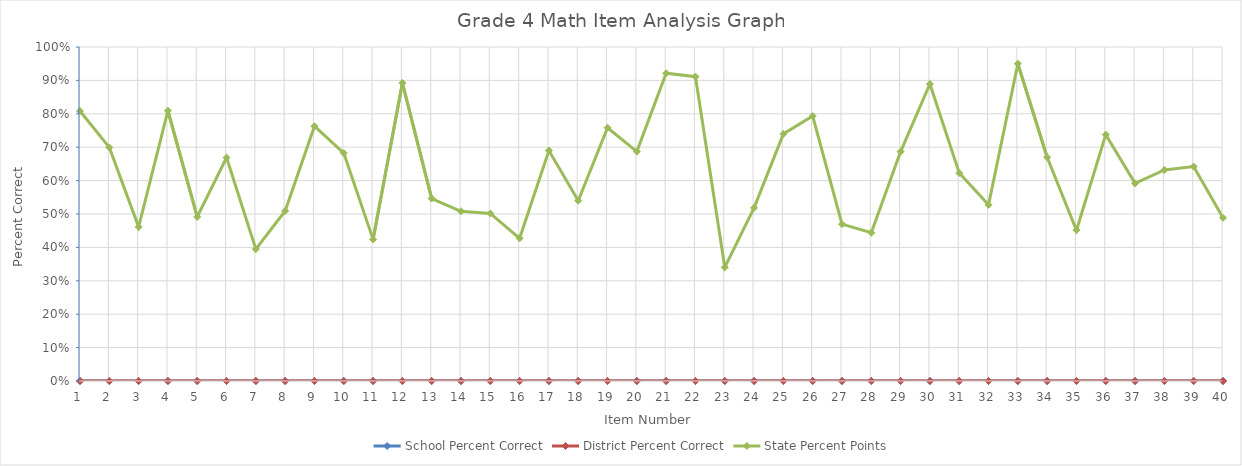
| Category | School Percent Correct | District Percent Correct | State Percent Points |
|---|---|---|---|
| 1.0 | 0 | 0 | 0.808 |
| 2.0 | 0 | 0 | 0.699 |
| 3.0 | 0 | 0 | 0.461 |
| 4.0 | 0 | 0 | 0.809 |
| 5.0 | 0 | 0 | 0.491 |
| 6.0 | 0 | 0 | 0.669 |
| 7.0 | 0 | 0 | 0.395 |
| 8.0 | 0 | 0 | 0.509 |
| 9.0 | 0 | 0 | 0.763 |
| 10.0 | 0 | 0 | 0.682 |
| 11.0 | 0 | 0 | 0.424 |
| 12.0 | 0 | 0 | 0.892 |
| 13.0 | 0 | 0 | 0.546 |
| 14.0 | 0 | 0 | 0.508 |
| 15.0 | 0 | 0 | 0.502 |
| 16.0 | 0 | 0 | 0.427 |
| 17.0 | 0 | 0 | 0.69 |
| 18.0 | 0 | 0 | 0.54 |
| 19.0 | 0 | 0 | 0.758 |
| 20.0 | 0 | 0 | 0.687 |
| 21.0 | 0 | 0 | 0.921 |
| 22.0 | 0 | 0 | 0.911 |
| 23.0 | 0 | 0 | 0.34 |
| 24.0 | 0 | 0 | 0.518 |
| 25.0 | 0 | 0 | 0.74 |
| 26.0 | 0 | 0 | 0.793 |
| 27.0 | 0 | 0 | 0.47 |
| 28.0 | 0 | 0 | 0.444 |
| 29.0 | 0 | 0 | 0.687 |
| 30.0 | 0 | 0 | 0.889 |
| 31.0 | 0 | 0 | 0.622 |
| 32.0 | 0 | 0 | 0.527 |
| 33.0 | 0 | 0 | 0.95 |
| 34.0 | 0 | 0 | 0.67 |
| 35.0 | 0 | 0 | 0.452 |
| 36.0 | 0 | 0 | 0.738 |
| 37.0 | 0 | 0 | 0.592 |
| 38.0 | 0 | 0 | 0.632 |
| 39.0 | 0 | 0 | 0.642 |
| 40.0 | 0 | 0 | 0.489 |